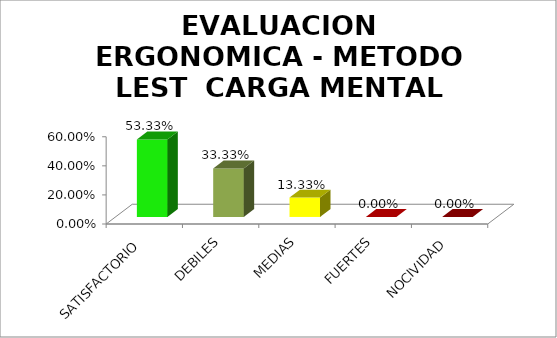
| Category | EVALUACION ERGONOMICA - METODO LEST  |
|---|---|
| SATISFACTORIO | 0.533 |
| DEBILES | 0.333 |
| MEDIAS | 0.133 |
| FUERTES | 0 |
| NOCIVIDAD | 0 |